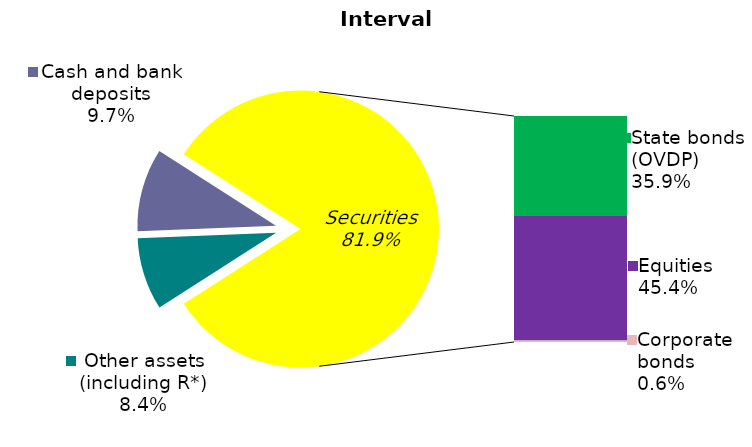
| Category | Series 0 |
|---|---|
| Other assets (including R*) | 0.084 |
| Cash and bank deposits | 0.097 |
| Bank metals | 0 |
| State bonds (OVDP) | 0.359 |
| Equities | 0.454 |
| Corporate bonds | 0.006 |
| Other Securities | 0 |